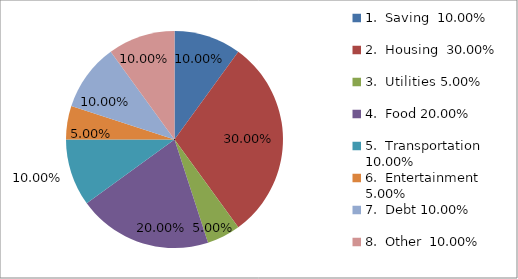
| Category | Series 0 | 100.00% 10.00% 30.00% 5.00% 20.00% 10.00% 5.00% 10.00% 10.00% |
|---|---|---|
| 0 | 0.1 |  |
| 1 | 0.3 |  |
| 2 | 0.05 |  |
| 3 | 0.2 |  |
| 4 | 0.1 |  |
| 5 | 0.05 |  |
| 6 | 0.1 |  |
| 7 | 0.1 |  |